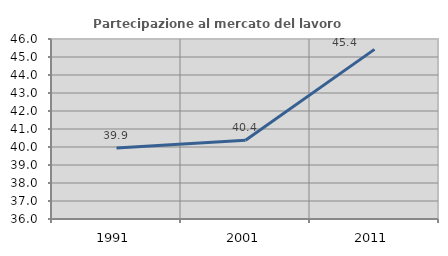
| Category | Partecipazione al mercato del lavoro  femminile |
|---|---|
| 1991.0 | 39.949 |
| 2001.0 | 40.373 |
| 2011.0 | 45.423 |